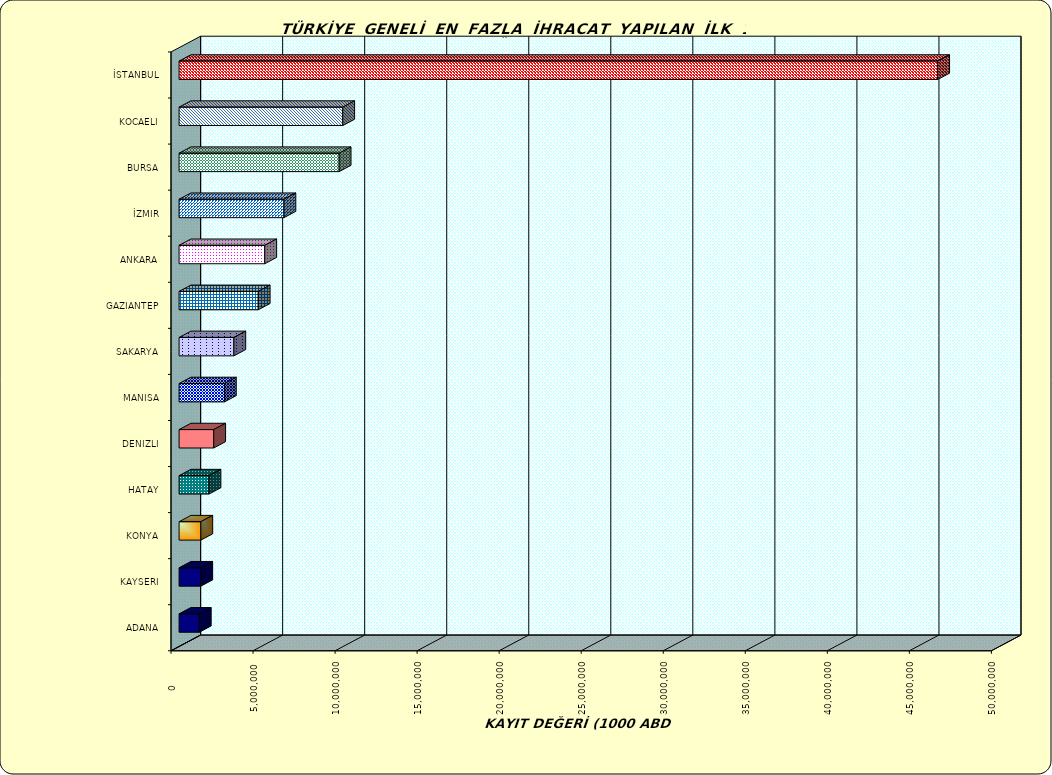
| Category | Series 0 |
|---|---|
| İSTANBUL | 46235612.517 |
| KOCAELI | 9975707.421 |
| BURSA | 9757786.298 |
| İZMIR | 6391615.713 |
| ANKARA | 5223108.975 |
| GAZIANTEP | 4825396.572 |
| SAKARYA | 3339607.74 |
| MANISA | 2763315.579 |
| DENIZLI | 2112114.538 |
| HATAY | 1825070.137 |
| KONYA | 1326677.179 |
| KAYSERI | 1324627.853 |
| ADANA | 1232251.727 |